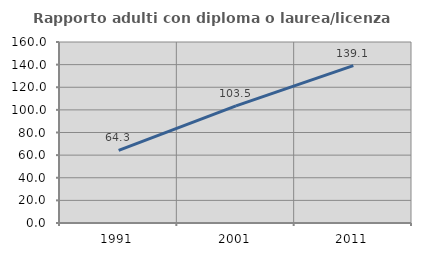
| Category | Rapporto adulti con diploma o laurea/licenza media  |
|---|---|
| 1991.0 | 64.257 |
| 2001.0 | 103.509 |
| 2011.0 | 139.051 |